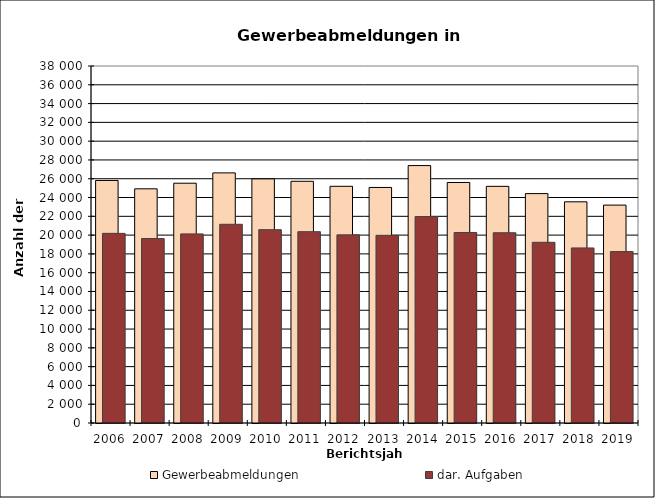
| Category | Gewerbeabmeldungen | dar. Aufgaben |
|---|---|---|
| 2006.0 | 25816 | 20185 |
| 2007.0 | 24926 | 19635 |
| 2008.0 | 25523 | 20128 |
| 2009.0 | 26623 | 21151 |
| 2010.0 | 25984 | 20578 |
| 2011.0 | 25729 | 20364 |
| 2012.0 | 25195 | 20027 |
| 2013.0 | 25071 | 19975 |
| 2014.0 | 27402 | 21971 |
| 2015.0 | 25601 | 20280 |
| 2016.0 | 25189 | 20252 |
| 2017.0 | 24417 | 19234 |
| 2018.0 | 23545 | 18633 |
| 2019.0 | 23193 | 18245 |